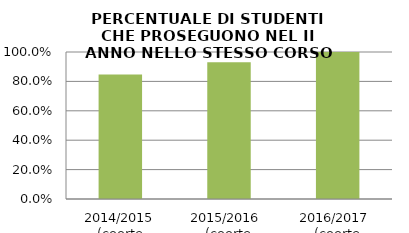
| Category | 2014/2015 (coorte 2013/14) 2015/2016  (coorte 2014/15) 2016/2017  (coorte 2015/16) |
|---|---|
| 2014/2015 (coorte 2013/14) | 0.846 |
| 2015/2016  (coorte 2014/15) | 0.93 |
| 2016/2017  (coorte 2015/16) | 1 |